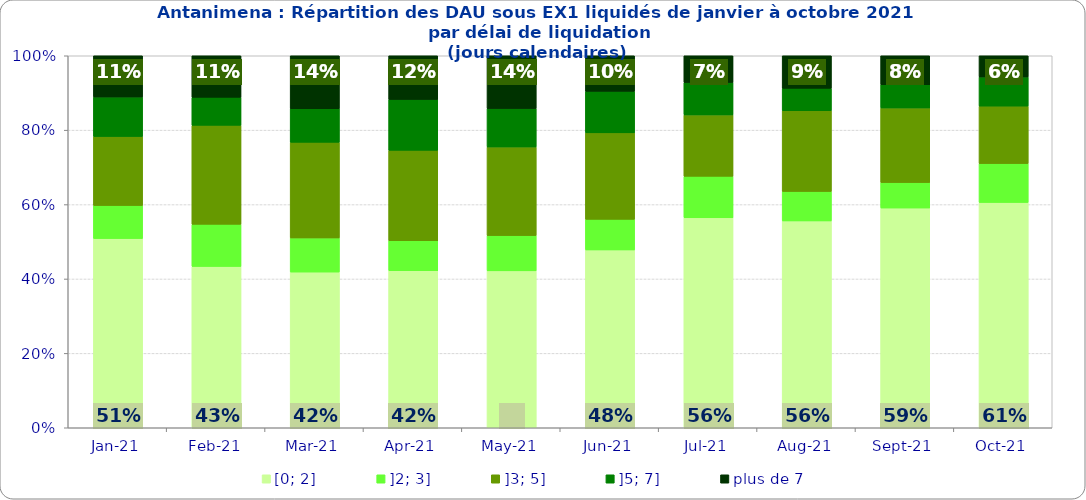
| Category | [0; 2] | ]2; 3] | ]3; 5] | ]5; 7] | plus de 7 |
|---|---|---|---|---|---|
| 2021-01-01 | 0.509 | 0.089 | 0.185 | 0.106 | 0.111 |
| 2021-02-01 | 0.434 | 0.113 | 0.266 | 0.076 | 0.112 |
| 2021-03-01 | 0.419 | 0.092 | 0.257 | 0.09 | 0.142 |
| 2021-04-01 | 0.422 | 0.08 | 0.243 | 0.137 | 0.117 |
| 2021-05-01 | 0.422 | 0.095 | 0.238 | 0.103 | 0.142 |
| 2021-06-01 | 0.478 | 0.082 | 0.233 | 0.111 | 0.096 |
| 2021-07-01 | 0.564 | 0.112 | 0.165 | 0.087 | 0.072 |
| 2021-08-01 | 0.556 | 0.079 | 0.217 | 0.06 | 0.087 |
| 2021-09-01 | 0.591 | 0.069 | 0.201 | 0.063 | 0.078 |
| 2021-10-01 | 0.606 | 0.105 | 0.154 | 0.078 | 0.057 |